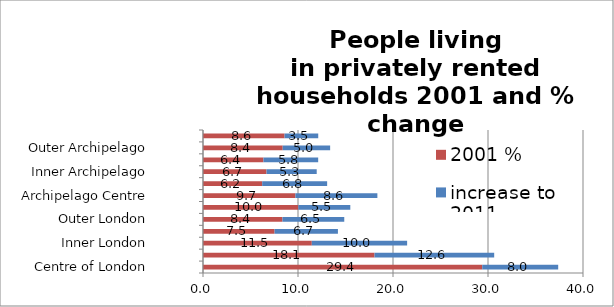
| Category | 2001 % | increase to 2011 |
|---|---|---|
| Centre of London | 29.394 | 7.995 |
| London Core | 18.055 | 12.596 |
| Inner London | 11.453 | 10.034 |
| London Suburbs | 7.534 | 6.669 |
| Outer London | 8.364 | 6.506 |
| London Edge | 10.034 | 5.471 |
| Archipelago Centre | 9.727 | 8.629 |
| Archipelago Core | 6.231 | 6.837 |
| Inner Archipelago | 6.688 | 5.282 |
| Archipelago Suburbs | 6.362 | 5.762 |
| Outer Archipelago | 8.389 | 4.994 |
| Archipelago Edge | 8.585 | 3.545 |